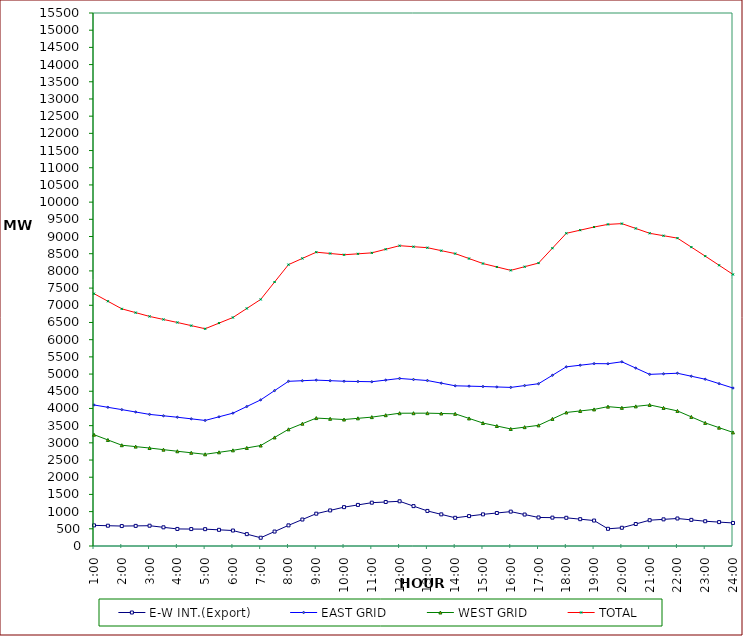
| Category | E-W INT.(Export) | EAST GRID | WEST GRID | TOTAL |
|---|---|---|---|---|
| 1:00 | 600 | 4101 | 3237 | 7338 |
| 1:30 | 590 | 4033.5 | 3084 | 7117.5 |
| 2:00 | 580 | 3966 | 2931 | 6897 |
| 2:30 | 585 | 3896.5 | 2890 | 6786.5 |
| 3:00 | 590 | 3827 | 2849 | 6676 |
| 3:30 | 543 | 3786 | 2802 | 6588 |
| 4:00 | 496 | 3745 | 2755 | 6500 |
| 4:30 | 493 | 3698 | 2711 | 6409 |
| 5:00 | 490 | 3651 | 2667 | 6318 |
| 5:30 | 470 | 3757 | 2724.5 | 6481.5 |
| 6:00 | 450 | 3863 | 2782 | 6645 |
| 6:30 | 345 | 4056 | 2852 | 6908 |
| 7:00 | 240 | 4249 | 2922 | 7171 |
| 7:30 | 420 | 4519 | 3157.5 | 7676.5 |
| 8:00 | 600 | 4789 | 3393 | 8182 |
| 8:30 | 770 | 4806.5 | 3556.5 | 8363 |
| 9:00 | 940 | 4824 | 3720 | 8544 |
| 9:30 | 1035 | 4807.5 | 3699 | 8506.5 |
| 10:00 | 1130 | 4791 | 3678 | 8469 |
| 10:30 | 1195 | 4784 | 3713 | 8497 |
| 11:00 | 1260 | 4777 | 3748 | 8525 |
| 11:30 | 1280 | 4824.5 | 3804.5 | 8629 |
| 12:00 | 1300 | 4872 | 3861 | 8733 |
| 12:30 | 1160 | 4842 | 3862 | 8704 |
| 13:00 | 1020 | 4812 | 3863 | 8675 |
| 13:30 | 920 | 4735.5 | 3853.5 | 8589 |
| 14:00 | 820 | 4659 | 3844 | 8503 |
| 14:30 | 870 | 4648.5 | 3710 | 8358.5 |
| 15:00 | 920 | 4638 | 3576 | 8214 |
| 15:30 | 960 | 4625 | 3490 | 8115 |
| 16:00 | 1000 | 4612 | 3404 | 8016 |
| 16:30 | 915 | 4665.5 | 3456.5 | 8122 |
| 17:00 | 830 | 4719 | 3509 | 8228 |
| 17:30 | 825 | 4964.5 | 3696 | 8660.5 |
| 18:00 | 820 | 5210 | 3883 | 9093 |
| 18:30 | 780 | 5257 | 3927.5 | 9184.5 |
| 19:00 | 740 | 5304 | 3972 | 9276 |
| 19:30 | 500 | 5300 | 4053 | 9353 |
| 20:00 | 530 | 5357 | 4018 | 9375 |
| 20:30 | 640 | 5174 | 4060.5 | 9234.5 |
| 21:00 | 750 | 4991 | 4103 | 9094 |
| 21:30 | 775 | 5007.5 | 4016 | 9023.5 |
| 22:00 | 800 | 5024 | 3929 | 8953 |
| 22:30 | 760 | 4937 | 3754.5 | 8691.5 |
| 23:00 | 720 | 4850 | 3580 | 8430 |
| 23:30 | 695 | 4722 | 3441.5 | 8163.5 |
| 24:00 | 670 | 4594 | 3303 | 7897 |